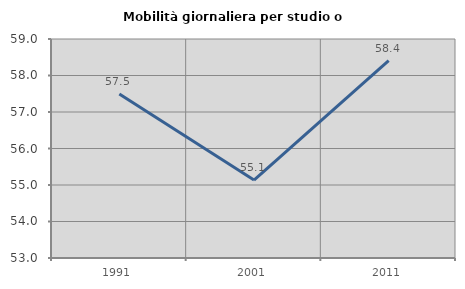
| Category | Mobilità giornaliera per studio o lavoro |
|---|---|
| 1991.0 | 57.493 |
| 2001.0 | 55.135 |
| 2011.0 | 58.41 |